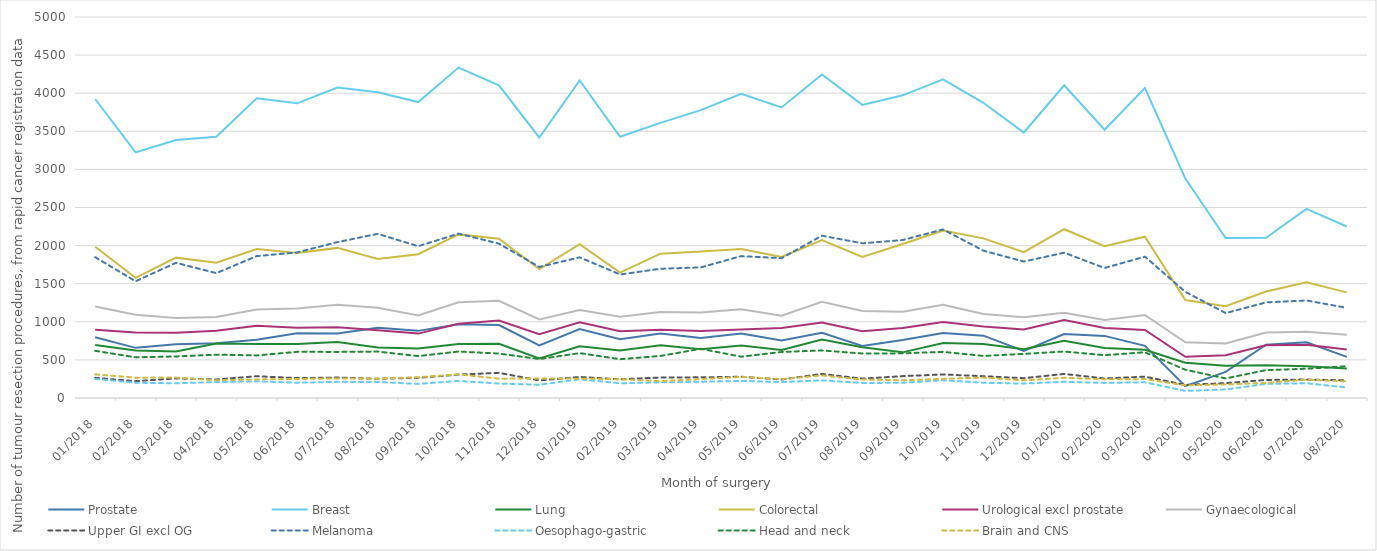
| Category | Prostate | Breast | Lung | Colorectal | Urological excl prostate | Gynaecological | Upper GI excl OG | Melanoma | Oesophago-gastric | Head and neck | Brain and CNS |
|---|---|---|---|---|---|---|---|---|---|---|---|
| 2018-01-01 | 797 | 3924 | 697 | 1985 | 895 | 1202 | 265 | 1848 | 250 | 619 | 310 |
| 2018-02-01 | 658 | 3223 | 624 | 1576 | 858 | 1092 | 221 | 1532 | 200 | 534 | 267 |
| 2018-03-01 | 706 | 3385 | 609 | 1842 | 856 | 1049 | 257 | 1774 | 193 | 545 | 268 |
| 2018-04-01 | 720 | 3429 | 715 | 1776 | 882 | 1063 | 243 | 1639 | 209 | 569 | 233 |
| 2018-05-01 | 764 | 3933 | 708 | 1954 | 947 | 1160 | 286 | 1862 | 219 | 559 | 244 |
| 2018-06-01 | 849 | 3867 | 709 | 1904 | 923 | 1176 | 261 | 1911 | 200 | 606 | 249 |
| 2018-07-01 | 845 | 4074 | 735 | 1970 | 930 | 1225 | 268 | 2046 | 212 | 605 | 257 |
| 2018-08-01 | 922 | 4013 | 664 | 1824 | 889 | 1185 | 253 | 2154 | 210 | 609 | 254 |
| 2018-09-01 | 881 | 3884 | 649 | 1887 | 845 | 1082 | 265 | 1992 | 185 | 550 | 273 |
| 2018-10-01 | 969 | 4336 | 710 | 2147 | 974 | 1257 | 307 | 2157 | 224 | 610 | 310 |
| 2018-11-01 | 957 | 4102 | 712 | 2091 | 1018 | 1276 | 330 | 2026 | 190 | 583 | 254 |
| 2018-12-01 | 691 | 3419 | 520 | 1693 | 838 | 1032 | 231 | 1720 | 174 | 511 | 255 |
| 2019-01-01 | 904 | 4168 | 680 | 2019 | 994 | 1154 | 276 | 1846 | 246 | 589 | 254 |
| 2019-02-01 | 770 | 3429 | 625 | 1646 | 875 | 1065 | 245 | 1621 | 193 | 509 | 246 |
| 2019-03-01 | 847 | 3611 | 693 | 1894 | 896 | 1127 | 269 | 1696 | 205 | 552 | 221 |
| 2019-04-01 | 787 | 3778 | 639 | 1921 | 878 | 1123 | 271 | 1714 | 214 | 646 | 248 |
| 2019-05-01 | 845 | 3992 | 689 | 1955 | 900 | 1166 | 279 | 1862 | 224 | 542 | 277 |
| 2019-06-01 | 756 | 3813 | 630 | 1850 | 920 | 1079 | 243 | 1835 | 209 | 604 | 248 |
| 2019-07-01 | 856 | 4246 | 766 | 2072 | 991 | 1263 | 316 | 2130 | 231 | 624 | 296 |
| 2019-08-01 | 684 | 3847 | 667 | 1851 | 876 | 1142 | 254 | 2030 | 197 | 584 | 242 |
| 2019-09-01 | 761 | 3972 | 599 | 2020 | 919 | 1133 | 287 | 2073 | 200 | 586 | 233 |
| 2019-10-01 | 854 | 4182 | 723 | 2197 | 997 | 1222 | 309 | 2212 | 233 | 605 | 251 |
| 2019-11-01 | 818 | 3874 | 708 | 2095 | 937 | 1102 | 286 | 1933 | 200 | 552 | 268 |
| 2019-12-01 | 617 | 3484 | 640 | 1914 | 899 | 1060 | 260 | 1791 | 189 | 579 | 231 |
| 2020-01-01 | 840 | 4104 | 751 | 2215 | 1022 | 1119 | 316 | 1907 | 213 | 610 | 265 |
| 2020-02-01 | 815 | 3521 | 657 | 1992 | 919 | 1025 | 256 | 1706 | 198 | 562 | 246 |
| 2020-03-01 | 684 | 4068 | 633 | 2117 | 892 | 1089 | 280 | 1855 | 206 | 600 | 248 |
| 2020-04-01 | 156 | 2881 | 464 | 1286 | 540 | 730 | 172 | 1393 | 93 | 371 | 166 |
| 2020-05-01 | 342 | 2100 | 423 | 1204 | 560 | 715 | 195 | 1114 | 112 | 257 | 178 |
| 2020-06-01 | 699 | 2102 | 431 | 1397 | 692 | 859 | 237 | 1255 | 185 | 366 | 198 |
| 2020-07-01 | 731 | 2481 | 417 | 1518 | 699 | 871 | 242 | 1280 | 194 | 384 | 242 |
| 2020-08-01 | 540 | 2251 | 386 | 1386 | 638 | 830 | 232 | 1183 | 138 | 417 | 218 |